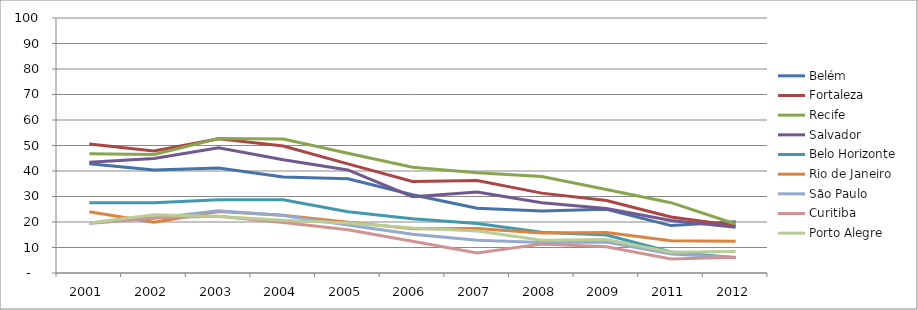
| Category | Belém | Fortaleza | Recife | Salvador | Belo Horizonte | Rio de Janeiro | São Paulo | Curitiba | Porto Alegre |
|---|---|---|---|---|---|---|---|---|---|
| 2001.0 | 42.88 | 50.62 | 46.72 | 43.47 | 27.52 | 24.04 | 19.55 | 19.52 | 19.65 |
| 2002.0 | 40.39 | 47.88 | 46.48 | 44.9 | 27.57 | 19.9 | 21.46 | 21.63 | 22.81 |
| 2003.0 | 41.15 | 52.67 | 52.71 | 49.12 | 28.69 | 24.1 | 24.4 | 22.26 | 22.14 |
| 2004.0 | 37.64 | 49.78 | 52.57 | 44.39 | 28.69 | 22.62 | 22.52 | 19.8 | 20.68 |
| 2005.0 | 36.98 | 42.8 | 46.93 | 40.43 | 24.02 | 19.95 | 18.82 | 16.94 | 19.58 |
| 2006.0 | 30.67 | 35.93 | 41.47 | 29.94 | 21.32 | 17.38 | 15.16 | 12.48 | 17.62 |
| 2007.0 | 25.36 | 36.3 | 39.28 | 31.77 | 19.4 | 17.41 | 12.81 | 7.87 | 16.51 |
| 2008.0 | 24.34 | 31.32 | 37.88 | 27.51 | 15.99 | 15.64 | 11.92 | 11.41 | 12.86 |
| 2009.0 | 25 | 28.42 | 32.76 | 25.32 | 14.88 | 15.85 | 12.14 | 10.32 | 13.1 |
| 2011.0 | 18.59 | 21.96 | 27.57 | 20.61 | 8.26 | 12.65 | 7.41 | 5.51 | 8.11 |
| 2012.0 | 20.08 | 18.49 | 19.2 | 17.91 | 5.98 | 12.43 | 6.09 | 6.2 | 8.47 |